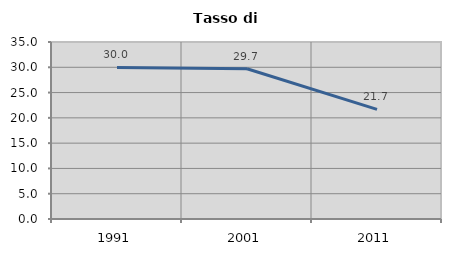
| Category | Tasso di disoccupazione   |
|---|---|
| 1991.0 | 29.96 |
| 2001.0 | 29.705 |
| 2011.0 | 21.667 |